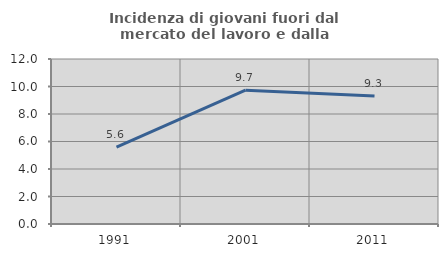
| Category | Incidenza di giovani fuori dal mercato del lavoro e dalla formazione  |
|---|---|
| 1991.0 | 5.594 |
| 2001.0 | 9.735 |
| 2011.0 | 9.302 |